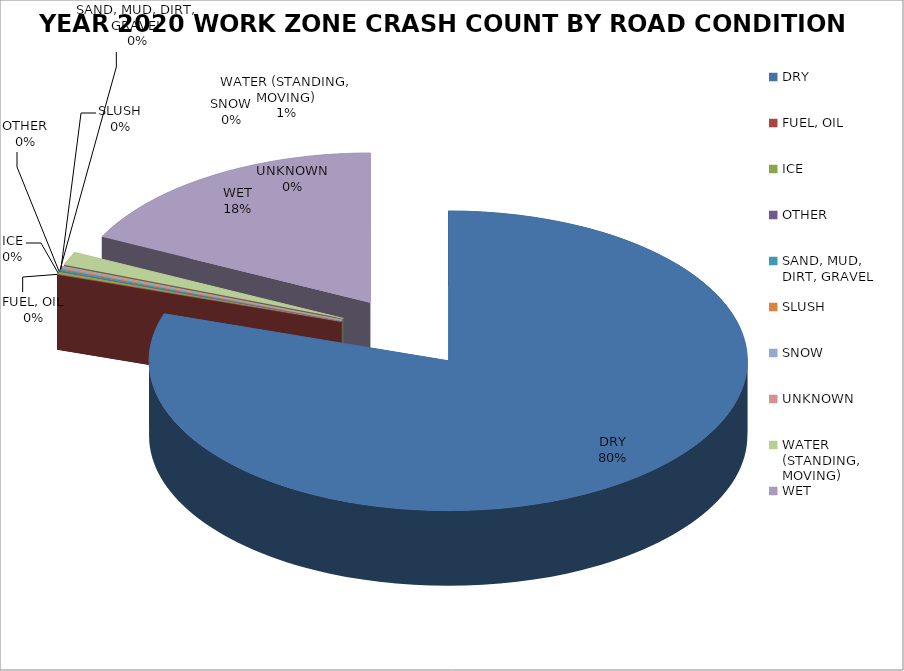
| Category | YEAR 2020 WORK ZONE CRASH COUNT* |
|---|---|
| DRY | 0.801 |
| FUEL, OIL | 0 |
| ICE | 0.002 |
| OTHER | 0 |
| SAND, MUD, DIRT, GRAVEL | 0.002 |
| SLUSH | 0.001 |
| SNOW | 0.001 |
| UNKNOWN | 0.001 |
| WATER (STANDING, MOVING) | 0.014 |
| WET | 0.177 |